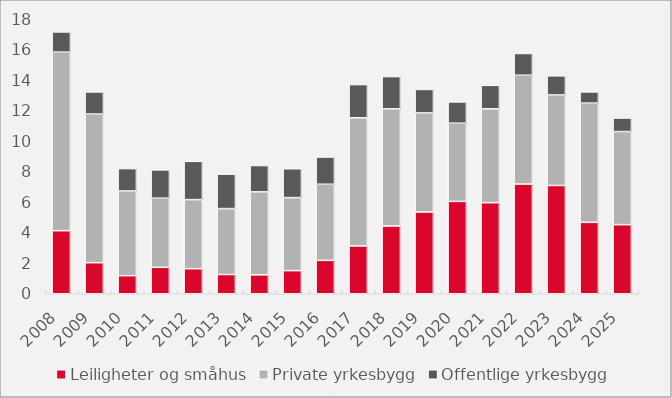
| Category | Leiligheter og småhus | Private yrkesbygg | Offentlige yrkesbygg |
|---|---|---|---|
| 2008.0 | 4.128 | 11.688 | 1.323 |
| 2009.0 | 2.035 | 9.726 | 1.45 |
| 2010.0 | 1.184 | 5.544 | 1.465 |
| 2011.0 | 1.73 | 4.525 | 1.853 |
| 2012.0 | 1.642 | 4.52 | 2.505 |
| 2013.0 | 1.26 | 4.314 | 2.254 |
| 2014.0 | 1.24 | 5.428 | 1.725 |
| 2015.0 | 1.515 | 4.777 | 1.892 |
| 2016.0 | 2.186 | 4.98 | 1.786 |
| 2017.0 | 3.133 | 8.385 | 2.175 |
| 2018.0 | 4.437 | 7.666 | 2.113 |
| 2019.0 | 5.351 | 6.483 | 1.54 |
| 2020.0 | 6.046 | 5.117 | 1.393 |
| 2021.0 | 5.962 | 6.142 | 1.538 |
| 2022.0 | 7.182 | 7.122 | 1.423 |
| 2023.0 | 7.089 | 5.921 | 1.255 |
| 2024.0 | 4.674 | 7.803 | 0.737 |
| 2025.0 | 4.523 | 6.093 | 0.888 |